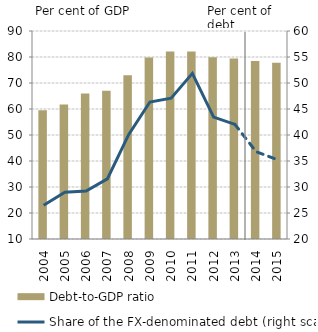
| Category | Debt-to-GDP ratio |
|---|---|
| 2004.0 | 59.503 |
| 2005.0 | 61.687 |
| 2006.0 | 65.914 |
| 2007.0 | 67.062 |
| 2008.0 | 72.991 |
| 2009.0 | 79.799 |
| 2010.0 | 82.158 |
| 2011.0 | 82.134 |
| 2012.0 | 79.893 |
| 2013.0 | 79.38 |
| 2014.0 | 78.43 |
| 2015.0 | 77.81 |